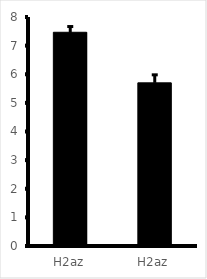
| Category | Series 0 |
|---|---|
| H2az | 7.467 |
| H2az | 5.7 |